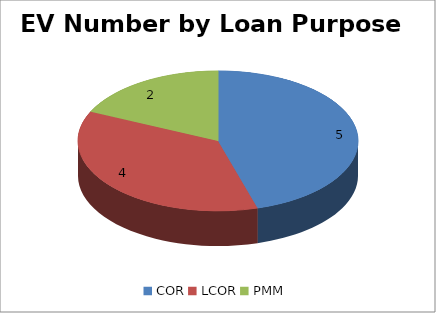
| Category | EV Number |
|---|---|
| COR | 5 |
| LCOR | 4 |
| PMM | 2 |